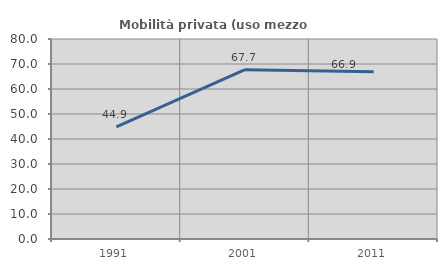
| Category | Mobilità privata (uso mezzo privato) |
|---|---|
| 1991.0 | 44.865 |
| 2001.0 | 67.742 |
| 2011.0 | 66.864 |